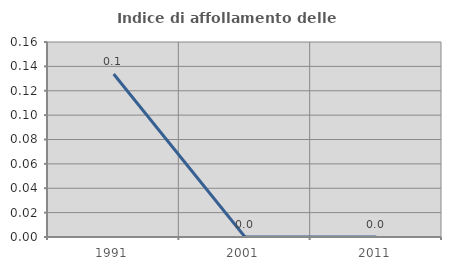
| Category | Indice di affollamento delle abitazioni  |
|---|---|
| 1991.0 | 0.134 |
| 2001.0 | 0 |
| 2011.0 | 0 |